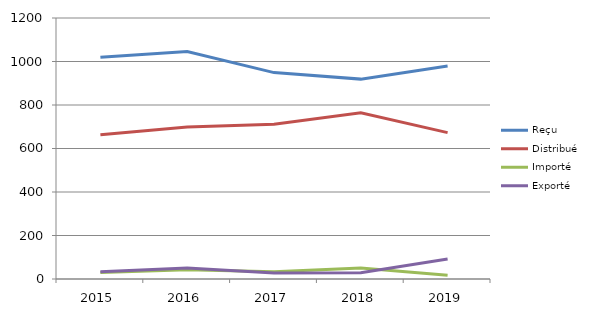
| Category | Reçu | Distribué | Importé | Exporté |
|---|---|---|---|---|
| 2015.0 | 1019 | 663 | 30 | 33 |
| 2016.0 | 1046 | 699 | 42 | 51 |
| 2017.0 | 949 | 712 | 33 | 28 |
| 2018.0 | 919 | 764 | 50 | 29 |
| 2019.0 | 979 | 673 | 17 | 92 |